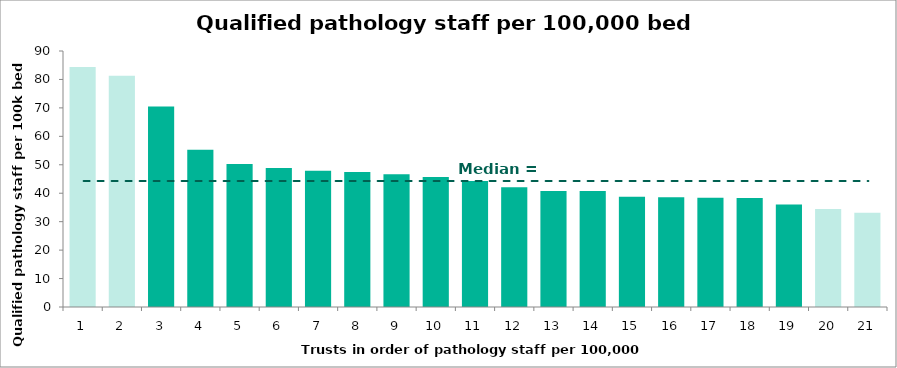
| Category | Staff |
|---|---|
| 0 | 84.353 |
| 1 | 81.324 |
| 2 | 70.509 |
| 3 | 55.254 |
| 4 | 50.23 |
| 5 | 48.83 |
| 6 | 47.885 |
| 7 | 47.485 |
| 8 | 46.699 |
| 9 | 45.69 |
| 10 | 44.309 |
| 11 | 42.059 |
| 12 | 40.779 |
| 13 | 40.747 |
| 14 | 38.782 |
| 15 | 38.541 |
| 16 | 38.41 |
| 17 | 38.333 |
| 18 | 36.013 |
| 19 | 34.429 |
| 20 | 33.135 |